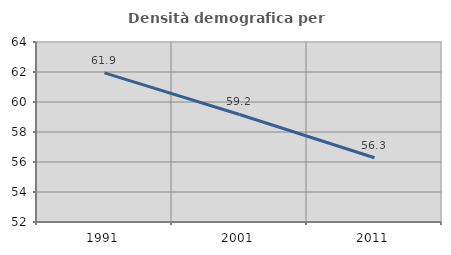
| Category | Densità demografica |
|---|---|
| 1991.0 | 61.944 |
| 2001.0 | 59.168 |
| 2011.0 | 56.286 |